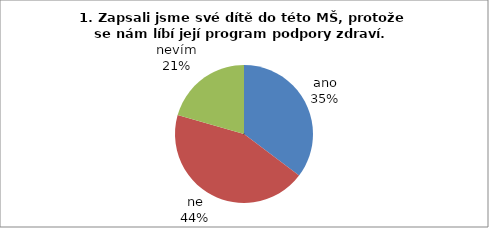
| Category | 1. |
|---|---|
| ano | 12 |
| ne | 15 |
| nevím | 7 |